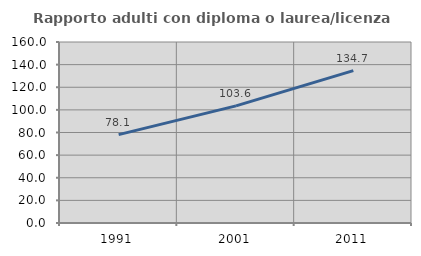
| Category | Rapporto adulti con diploma o laurea/licenza media  |
|---|---|
| 1991.0 | 78.125 |
| 2001.0 | 103.557 |
| 2011.0 | 134.737 |